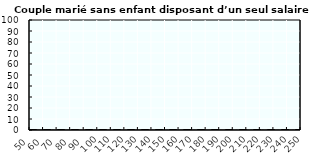
| Category | Coin fiscal marginal (somme des composantes) | Taux d’imposition marginal net |
|---|---|---|
| 50.0 | 0 | 0 |
| 51.0 | 0 | 0 |
| 52.0 | 0 | 0 |
| 53.0 | 0 | 0 |
| 54.0 | 0 | 0 |
| 55.0 | 0 | 0 |
| 56.0 | 0 | 0 |
| 57.0 | 0 | 0 |
| 58.0 | 0 | 0 |
| 59.0 | 0 | 0 |
| 60.0 | 0 | 0 |
| 61.0 | 0 | 0 |
| 62.0 | 0 | 0 |
| 63.0 | 0 | 0 |
| 64.0 | 0 | 0 |
| 65.0 | 0 | 0 |
| 66.0 | 0 | 0 |
| 67.0 | 0 | 0 |
| 68.0 | 0 | 0 |
| 69.0 | 0 | 0 |
| 70.0 | 0 | 0 |
| 71.0 | 0 | 0 |
| 72.0 | 0 | 0 |
| 73.0 | 0 | 0 |
| 74.0 | 0 | 0 |
| 75.0 | 0 | 0 |
| 76.0 | 0 | 0 |
| 77.0 | 0 | 0 |
| 78.0 | 0 | 0 |
| 79.0 | 0 | 0 |
| 80.0 | 0 | 0 |
| 81.0 | 0 | 0 |
| 82.0 | 0 | 0 |
| 83.0 | 0 | 0 |
| 84.0 | 0 | 0 |
| 85.0 | 0 | 0 |
| 86.0 | 0 | 0 |
| 87.0 | 0 | 0 |
| 88.0 | 0 | 0 |
| 89.0 | 0 | 0 |
| 90.0 | 0 | 0 |
| 91.0 | 0 | 0 |
| 92.0 | 0 | 0 |
| 93.0 | 0 | 0 |
| 94.0 | 0 | 0 |
| 95.0 | 0 | 0 |
| 96.0 | 0 | 0 |
| 97.0 | 0 | 0 |
| 98.0 | 0 | 0 |
| 99.0 | 0 | 0 |
| 100.0 | 0 | 0 |
| 101.0 | 0 | 0 |
| 102.0 | 0 | 0 |
| 103.0 | 0 | 0 |
| 104.0 | 0 | 0 |
| 105.0 | 0 | 0 |
| 106.0 | 0 | 0 |
| 107.0 | 0 | 0 |
| 108.0 | 0 | 0 |
| 109.0 | 0 | 0 |
| 110.0 | 0 | 0 |
| 111.0 | 0 | 0 |
| 112.0 | 0 | 0 |
| 113.0 | 0 | 0 |
| 114.0 | 0 | 0 |
| 115.0 | 0 | 0 |
| 116.0 | 0 | 0 |
| 117.0 | 0 | 0 |
| 118.0 | 0 | 0 |
| 119.0 | 0 | 0 |
| 120.0 | 0 | 0 |
| 121.0 | 0 | 0 |
| 122.0 | 0 | 0 |
| 123.0 | 0 | 0 |
| 124.0 | 0 | 0 |
| 125.0 | 0 | 0 |
| 126.0 | 0 | 0 |
| 127.0 | 0 | 0 |
| 128.0 | 0 | 0 |
| 129.0 | 0 | 0 |
| 130.0 | 0 | 0 |
| 131.0 | 0 | 0 |
| 132.0 | 0 | 0 |
| 133.0 | 0 | 0 |
| 134.0 | 0 | 0 |
| 135.0 | 0 | 0 |
| 136.0 | 0 | 0 |
| 137.0 | 0 | 0 |
| 138.0 | 0 | 0 |
| 139.0 | 0 | 0 |
| 140.0 | 0 | 0 |
| 141.0 | 0 | 0 |
| 142.0 | 0 | 0 |
| 143.0 | 0 | 0 |
| 144.0 | 0 | 0 |
| 145.0 | 0 | 0 |
| 146.0 | 0 | 0 |
| 147.0 | 0 | 0 |
| 148.0 | 0 | 0 |
| 149.0 | 0 | 0 |
| 150.0 | 0 | 0 |
| 151.0 | 0 | 0 |
| 152.0 | 0 | 0 |
| 153.0 | 0 | 0 |
| 154.0 | 0 | 0 |
| 155.0 | 0 | 0 |
| 156.0 | 0 | 0 |
| 157.0 | 0 | 0 |
| 158.0 | 0 | 0 |
| 159.0 | 0 | 0 |
| 160.0 | 0 | 0 |
| 161.0 | 0 | 0 |
| 162.0 | 0 | 0 |
| 163.0 | 0 | 0 |
| 164.0 | 0 | 0 |
| 165.0 | 0 | 0 |
| 166.0 | 0 | 0 |
| 167.0 | 0 | 0 |
| 168.0 | 0 | 0 |
| 169.0 | 0 | 0 |
| 170.0 | 0 | 0 |
| 171.0 | 0 | 0 |
| 172.0 | 0 | 0 |
| 173.0 | 0 | 0 |
| 174.0 | 0 | 0 |
| 175.0 | 0 | 0 |
| 176.0 | 0 | 0 |
| 177.0 | 0 | 0 |
| 178.0 | 0 | 0 |
| 179.0 | 0 | 0 |
| 180.0 | 0 | 0 |
| 181.0 | 0 | 0 |
| 182.0 | 0 | 0 |
| 183.0 | 0 | 0 |
| 184.0 | 0 | 0 |
| 185.0 | 0 | 0 |
| 186.0 | 0 | 0 |
| 187.0 | 0 | 0 |
| 188.0 | 0 | 0 |
| 189.0 | 0 | 0 |
| 190.0 | 0 | 0 |
| 191.0 | 0 | 0 |
| 192.0 | 0 | 0 |
| 193.0 | 0 | 0 |
| 194.0 | 0 | 0 |
| 195.0 | 0 | 0 |
| 196.0 | 0 | 0 |
| 197.0 | 0 | 0 |
| 198.0 | 0 | 0 |
| 199.0 | 0 | 0 |
| 200.0 | 0 | 0 |
| 201.0 | 0 | 0 |
| 202.0 | 0 | 0 |
| 203.0 | 0 | 0 |
| 204.0 | 0 | 0 |
| 205.0 | 0 | 0 |
| 206.0 | 0 | 0 |
| 207.0 | 0 | 0 |
| 208.0 | 0 | 0 |
| 209.0 | 0 | 0 |
| 210.0 | 0 | 0 |
| 211.0 | 0 | 0 |
| 212.0 | 0 | 0 |
| 213.0 | 0 | 0 |
| 214.0 | 0 | 0 |
| 215.0 | 0 | 0 |
| 216.0 | 0 | 0 |
| 217.0 | 0 | 0 |
| 218.0 | 0 | 0 |
| 219.0 | 0 | 0 |
| 220.0 | 0 | 0 |
| 221.0 | 0 | 0 |
| 222.0 | 0 | 0 |
| 223.0 | 0 | 0 |
| 224.0 | 0 | 0 |
| 225.0 | 0 | 0 |
| 226.0 | 0 | 0 |
| 227.0 | 0 | 0 |
| 228.0 | 0 | 0 |
| 229.0 | 0 | 0 |
| 230.0 | 0 | 0 |
| 231.0 | 0 | 0 |
| 232.0 | 0 | 0 |
| 233.0 | 0 | 0 |
| 234.0 | 0 | 0 |
| 235.0 | 0 | 0 |
| 236.0 | 0 | 0 |
| 237.0 | 0 | 0 |
| 238.0 | 0 | 0 |
| 239.0 | 0 | 0 |
| 240.0 | 0 | 0 |
| 241.0 | 0 | 0 |
| 242.0 | 0 | 0 |
| 243.0 | 0 | 0 |
| 244.0 | 0 | 0 |
| 245.0 | 0 | 0 |
| 246.0 | 0 | 0 |
| 247.0 | 0 | 0 |
| 248.0 | 0 | 0 |
| 249.0 | 0 | 0 |
| 250.0 | 0 | 0 |